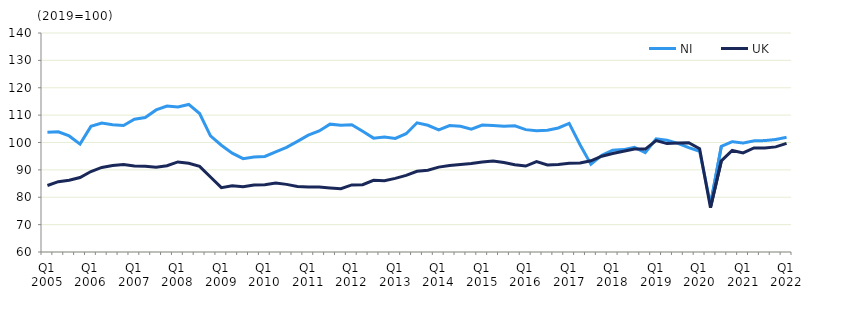
| Category | NI | UK  |
|---|---|---|
| Q1 2005 | 103.7 | 84.3 |
|  | 103.9 | 85.7 |
| Q3 2005 | 102.4 | 86.2 |
|  | 99.4 | 87.2 |
| Q1 2006 | 105.9 | 89.4 |
|  | 107.1 | 90.9 |
| Q3 2006 | 106.5 | 91.6 |
|  | 106.2 | 92 |
| Q1 2007 | 108.5 | 91.4 |
|  | 109.1 | 91.3 |
| Q3 2007 | 111.9 | 91 |
|  | 113.3 | 91.5 |
| Q1 2008 | 113 | 92.9 |
|  | 113.9 | 92.4 |
| Q3 2008 | 110.6 | 91.3 |
|  | 102.4 | 87.4 |
| Q1 2009 | 99 | 83.5 |
|  | 96.1 | 84.2 |
| Q3 2009 | 94.1 | 83.8 |
|  | 94.7 | 84.5 |
| Q1 2010 | 94.9 | 84.6 |
|  | 96.6 | 85.2 |
| Q3 2010 | 98.2 | 84.7 |
|  | 100.4 | 83.9 |
| Q1 2011 | 102.7 | 83.7 |
|  | 104.2 | 83.7 |
| Q3 2011 | 106.7 | 83.4 |
|  | 106.3 | 83.1 |
| Q1 2012 | 106.5 | 84.5 |
|  | 104.1 | 84.6 |
| Q3 2012 | 101.6 | 86.2 |
|  | 102 | 86 |
| Q1 2013 | 101.5 | 86.9 |
|  | 103.2 | 88 |
| Q3 2013 | 107.2 | 89.5 |
|  | 106.3 | 89.9 |
| Q1 2014 | 104.6 | 91 |
|  | 106.2 | 91.6 |
| Q3 2014 | 105.9 | 92 |
|  | 104.9 | 92.3 |
| Q1 2015 | 106.4 | 92.9 |
|  | 106.2 | 93.2 |
| Q3 2015 | 105.9 | 92.7 |
|  | 106.1 | 91.9 |
| Q1 2016 | 104.7 | 91.4 |
|  | 104.3 | 93 |
| Q3 2016 | 104.5 | 91.8 |
|  | 105.3 | 92 |
| Q1 2017 | 107 | 92.4 |
|  | 99.2 | 92.5 |
| Q3 2017 | 92.1 | 93.3 |
|  | 95.3 | 95 |
| Q1 2018 | 97.2 | 96 |
|  | 97.4 | 96.8 |
| Q3 2018 | 98.2 | 97.6 |
|  | 96.3 | 97.6 |
| Q1 2019 | 101.3 | 100.7 |
|  | 100.8 | 99.6 |
| Q3 2019 | 99.7 | 99.8 |
|  | 98.1 | 99.9 |
| Q1 2020 | 96.8 | 97.7 |
|  | 77.4 | 76.2 |
| Q3 2020 | 98.6 | 93.3 |
|  | 100.3 | 97.1 |
| Q1 2021 | 99.8 | 96.2 |
|  | 100.6 | 98 |
| Q3 2021 | 100.7 | 98 |
|  | 101.1 | 98.4 |
| Q1 2022 | 101.9 | 99.7 |